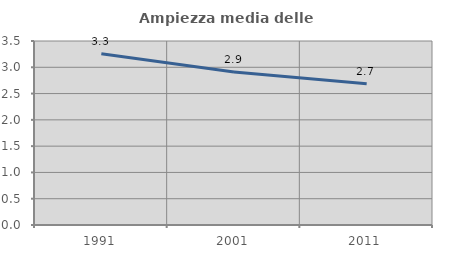
| Category | Ampiezza media delle famiglie |
|---|---|
| 1991.0 | 3.258 |
| 2001.0 | 2.911 |
| 2011.0 | 2.686 |